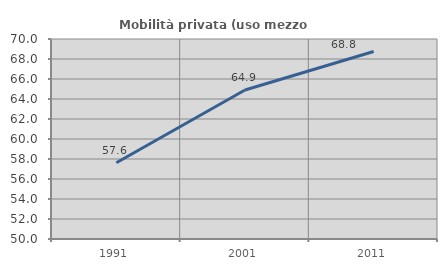
| Category | Mobilità privata (uso mezzo privato) |
|---|---|
| 1991.0 | 57.627 |
| 2001.0 | 64.901 |
| 2011.0 | 68.75 |